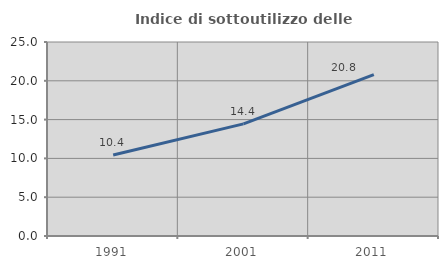
| Category | Indice di sottoutilizzo delle abitazioni  |
|---|---|
| 1991.0 | 10.435 |
| 2001.0 | 14.45 |
| 2011.0 | 20.788 |